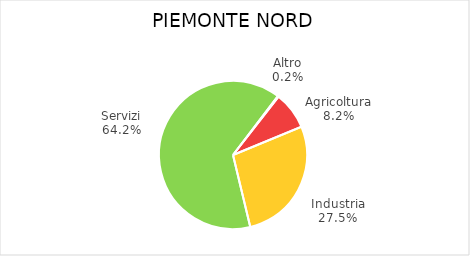
| Category | Piemonte Nord |
|---|---|
| Agricoltura | 6971 |
| Industria | 23345 |
| Servizi | 54456 |
| Altro | 166 |